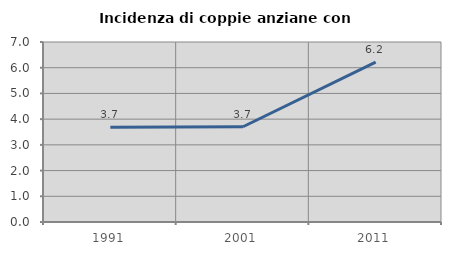
| Category | Incidenza di coppie anziane con figli |
|---|---|
| 1991.0 | 3.683 |
| 2001.0 | 3.704 |
| 2011.0 | 6.218 |